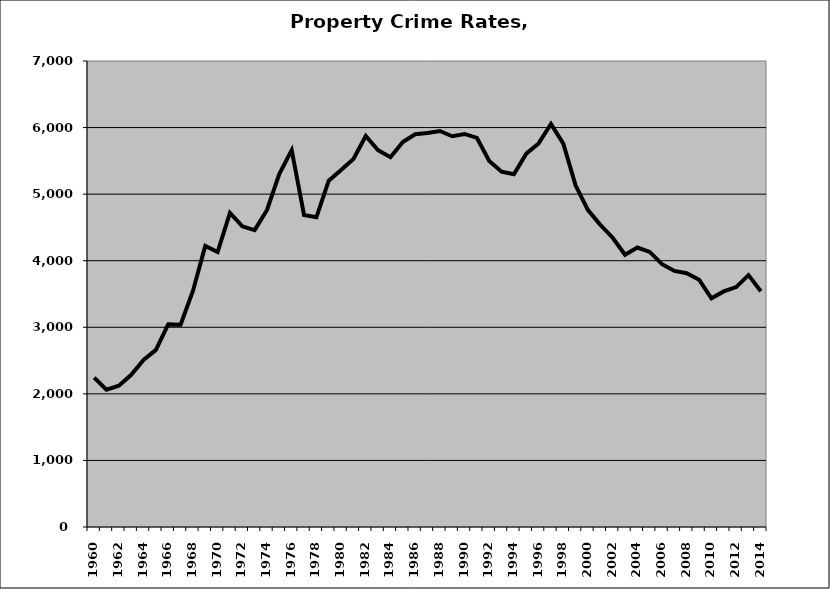
| Category | Property |
|---|---|
| 1960.0 | 2243.584 |
| 1961.0 | 2062.36 |
| 1962.0 | 2122.941 |
| 1963.0 | 2287.132 |
| 1964.0 | 2510.218 |
| 1965.0 | 2660.739 |
| 1966.0 | 3046.282 |
| 1967.0 | 3038.584 |
| 1968.0 | 3546.502 |
| 1969.0 | 4222.636 |
| 1970.0 | 4131.594 |
| 1971.0 | 4717.961 |
| 1972.0 | 4516.62 |
| 1973.0 | 4460.217 |
| 1974.0 | 4762.567 |
| 1975.0 | 5304.621 |
| 1976.0 | 5660.616 |
| 1977.0 | 4686.723 |
| 1978.0 | 4652.145 |
| 1979.0 | 5202.498 |
| 1980.0 | 5364.06 |
| 1981.0 | 5528.937 |
| 1982.0 | 5873.142 |
| 1983.0 | 5659.4 |
| 1984.0 | 5555.337 |
| 1985.0 | 5782.276 |
| 1986.0 | 5900.338 |
| 1987.0 | 5918.333 |
| 1988.0 | 5948.146 |
| 1989.0 | 5869.961 |
| 1990.0 | 5903.89 |
| 1991.0 | 5844.574 |
| 1992.0 | 5499.178 |
| 1993.0 | 5336.386 |
| 1994.0 | 5298.549 |
| 1995.0 | 5608.783 |
| 1996.0 | 5761.705 |
| 1997.0 | 6053.237 |
| 1998.0 | 5757.686 |
| 1999.0 | 5128.046 |
| 2000.0 | 4761.012 |
| 2001.0 | 4538.392 |
| 2002.0 | 4345.307 |
| 2003.0 | 4089.085 |
| 2004.0 | 4198.358 |
| 2005.0 | 4131.652 |
| 2006.0 | 3947.459 |
| 2007.0 | 3846.663 |
| 2008.0 | 3812.735 |
| 2009.0 | 3713.991 |
| 2010.0 | 3435.447 |
| 2011.0 | 3538.265 |
| 2012.0 | 3604.154 |
| 2013.0 | 3783.516 |
| 2014.0 | 3542.29 |